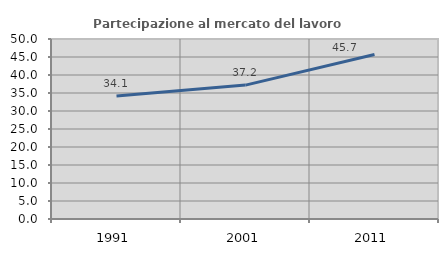
| Category | Partecipazione al mercato del lavoro  femminile |
|---|---|
| 1991.0 | 34.144 |
| 2001.0 | 37.194 |
| 2011.0 | 45.682 |